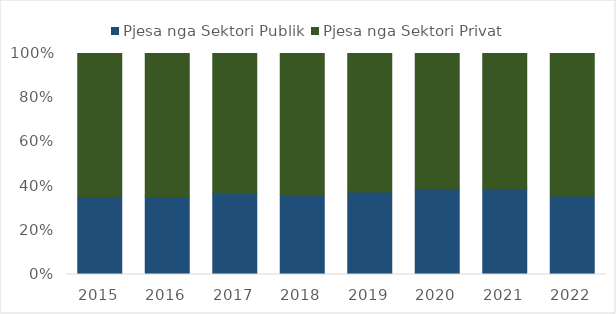
| Category | Pjesa nga Sektori Publik | Pjesa nga Sektori Privat |
|---|---|---|
| 2015.0 | 0.353 | 0.647 |
| 2016.0 | 0.352 | 0.648 |
| 2017.0 | 0.368 | 0.633 |
| 2018.0 | 0.361 | 0.639 |
| 2019.0 | 0.373 | 0.627 |
| 2020.0 | 0.385 | 0.615 |
| 2021.0 | 0.387 | 0.613 |
| 2022.0 | 0.356 | 0.644 |